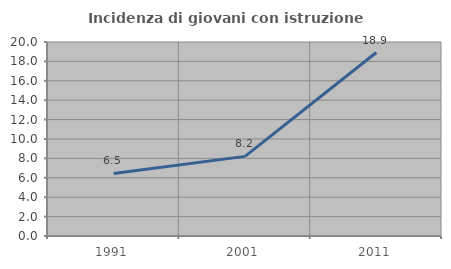
| Category | Incidenza di giovani con istruzione universitaria |
|---|---|
| 1991.0 | 6.452 |
| 2001.0 | 8.209 |
| 2011.0 | 18.913 |